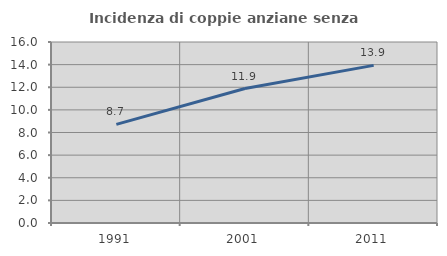
| Category | Incidenza di coppie anziane senza figli  |
|---|---|
| 1991.0 | 8.715 |
| 2001.0 | 11.885 |
| 2011.0 | 13.936 |